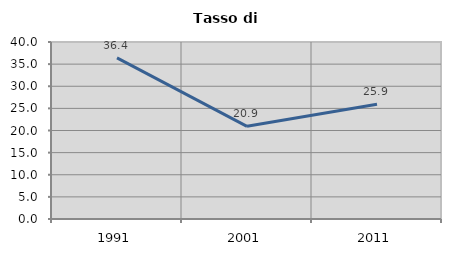
| Category | Tasso di disoccupazione   |
|---|---|
| 1991.0 | 36.417 |
| 2001.0 | 20.94 |
| 2011.0 | 25.945 |